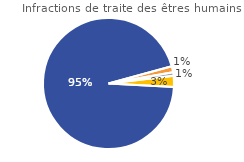
| Category | Infractions de traite des êtres humains |
|---|---|
| Instruction | 94.926 |
| COPJ* | 1.473 |
| Comparution immédiate | 0.9 |
| Autres | 2.7 |